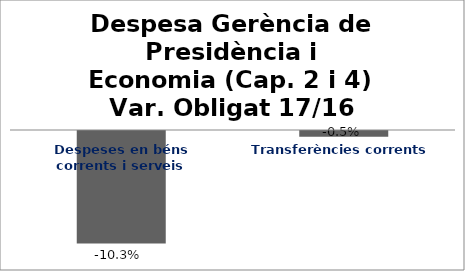
| Category | Series 0 |
|---|---|
| Despeses en béns corrents i serveis | -0.103 |
| Transferències corrents | -0.005 |